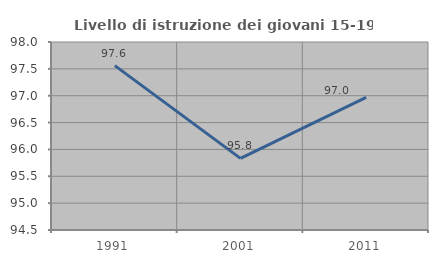
| Category | Livello di istruzione dei giovani 15-19 anni |
|---|---|
| 1991.0 | 97.561 |
| 2001.0 | 95.833 |
| 2011.0 | 96.97 |